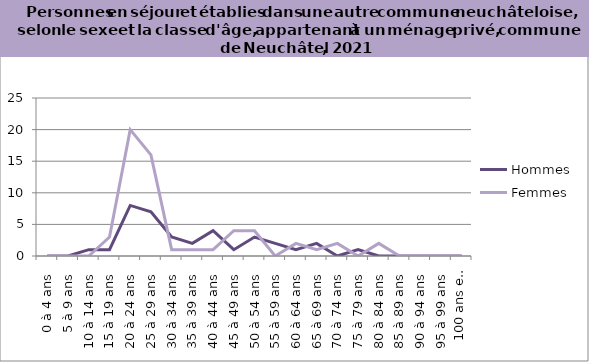
| Category | Hommes | Femmes |
|---|---|---|
| 0 à 4 ans | 0 | 0 |
| 5 à 9 ans | 0 | 0 |
| 10 à 14 ans | 1 | 0 |
| 15 à 19 ans | 1 | 3 |
| 20 à 24 ans | 8 | 20 |
| 25 à 29 ans | 7 | 16 |
| 30 à 34 ans | 3 | 1 |
| 35 à 39 ans | 2 | 1 |
| 40 à 44 ans | 4 | 1 |
| 45 à 49 ans | 1 | 4 |
| 50 à 54 ans | 3 | 4 |
| 55 à 59 ans | 2 | 0 |
| 60 à 64 ans | 1 | 2 |
| 65 à 69 ans | 2 | 1 |
| 70 à 74 ans | 0 | 2 |
| 75 à 79 ans | 1 | 0 |
| 80 à 84 ans | 0 | 2 |
| 85 à 89 ans | 0 | 0 |
| 90 à 94 ans | 0 | 0 |
| 95 à 99 ans | 0 | 0 |
| 100 ans et plus | 0 | 0 |